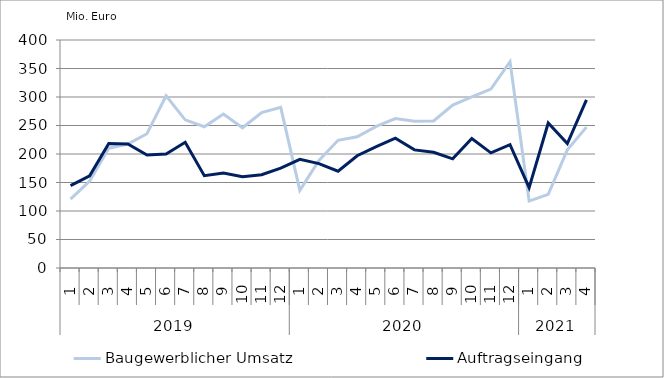
| Category | Baugewerblicher Umsatz | Auftragseingang |
|---|---|---|
| 0 | 120975.133 | 144510.881 |
| 1 | 152329.786 | 161685.201 |
| 2 | 210227.67 | 218455.879 |
| 3 | 217522.321 | 217610.064 |
| 4 | 235490.429 | 198110.439 |
| 5 | 301963.302 | 200012.086 |
| 6 | 259975.317 | 220559.061 |
| 7 | 247779.658 | 162059.723 |
| 8 | 270249.609 | 166829.611 |
| 9 | 245966.91 | 160120.773 |
| 10 | 272620.351 | 163589.389 |
| 11 | 281810.121 | 175051.247 |
| 12 | 136135.432 | 190647.086 |
| 13 | 188682.361 | 183141.14 |
| 14 | 224009.315 | 169770.009 |
| 15 | 230172.252 | 196979.845 |
| 16 | 248410.714 | 212955.83 |
| 17 | 262078.128 | 227853.487 |
| 18 | 257360.37 | 207209.188 |
| 19 | 257932.168 | 202976.091 |
| 20 | 285866.269 | 191463.844 |
| 21 | 300164.57 | 227245.467 |
| 22 | 313922.518 | 202060.636 |
| 23 | 362040.738 | 216296.504 |
| 24 | 117421.805 | 141020.655 |
| 25 | 129162.55 | 254416.876 |
| 26 | 207280.837 | 218451.405 |
| 27 | 247094.279 | 295077.868 |